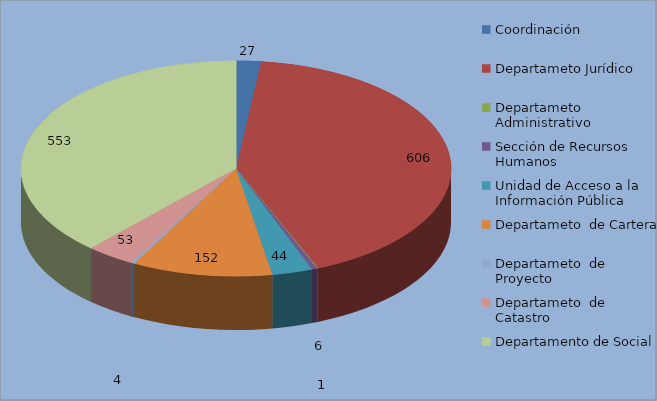
| Category | Series 0 |
|---|---|
| Coordinación | 27 |
| Departameto Jurídico  | 606 |
| Departameto Administrativo | 1 |
| Sección de Recursos Humanos | 6 |
| Unidad de Acceso a la Información Pública | 44 |
| Departameto  de Cartera | 152 |
| Departameto  de Proyecto | 4 |
| Departameto  de Catastro | 53 |
| Departamento de Social | 553 |